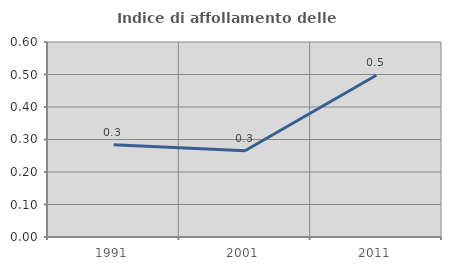
| Category | Indice di affollamento delle abitazioni  |
|---|---|
| 1991.0 | 0.284 |
| 2001.0 | 0.265 |
| 2011.0 | 0.498 |